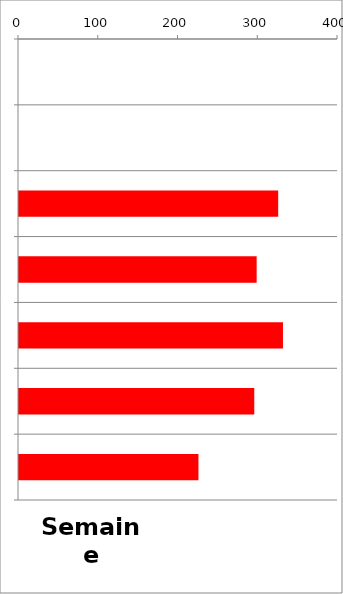
| Category | TV |
|---|---|
| 0 | 0 |
| 1 | 0 |
| 2 | 325 |
| 3 | 298 |
| 4 | 331 |
| 5 | 295 |
| 6 | 225 |